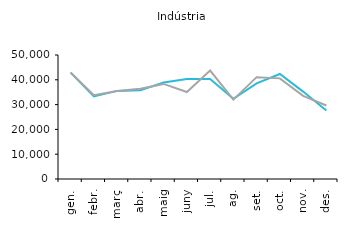
| Category | 2018 | 2019 |
|---|---|---|
| gen. | 42902 | 42965 |
| febr. | 33289 | 33778 |
| març | 35533 | 35440 |
| abr. | 35760 | 36377 |
| maig | 38920 | 38339 |
| juny | 40341 | 35083 |
| jul. | 40369 | 43725 |
| ag. | 32328 | 32014 |
| set. | 38583 | 41067 |
| oct. | 42347 | 40578 |
| nov. | 35245 | 33519 |
| des. | 27602 | 29634 |